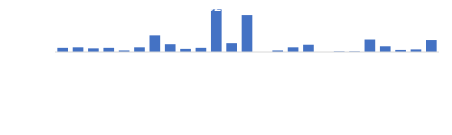
| Category | Total |
|---|---|
| Баацагаан сум | 8 |
| Баянбулаг сум | 9 |
| Баянговь сум | 7 |
| Баянлиг сум | 8 |
| Баян-Овоо сум | 3 |
| Баян-Өндөр сум | 9 |
| Баянхонгор аймгийн Засаг дарга | 32 |
| Баянхонгор сум | 15 |
| Баянцагаан сум | 6 |
| Богд сум | 8 |
| Боловсролын салбар | 82 |
| Бөмбөгөр сум | 17 |
| Бусад ТЕЗ-ийн харьяа | 71 |
| Бууцагаан сум | 0 |
| Галуут сум | 3 |
| Гурванбулаг сум | 9 |
| Жаргалант сум | 14 |
| Жинст сум | 0 |
| Заг сум | 1 |
| Өлзийт сум | 1 |
| Соёлын салбар | 24 |
| Хүрээмарал сум | 11 |
| Шинэжинст сум | 4 |
| Эрдэнэцогт сум | 5 |
| Эрүүл мэндийн салбар | 23 |